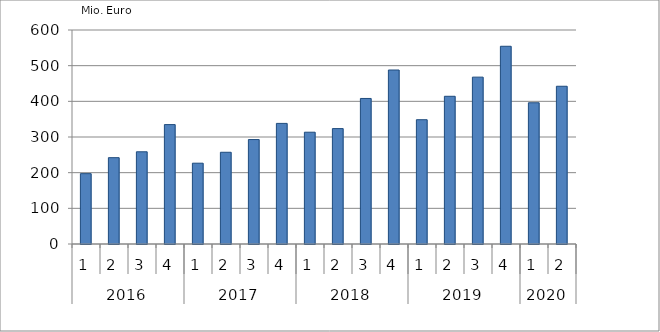
| Category | Ausbaugewerblicher Umsatz3 |
|---|---|
| 0 | 197219.532 |
| 1 | 242069.899 |
| 2 | 258547.84 |
| 3 | 334764.305 |
| 4 | 226552.317 |
| 5 | 257191.13 |
| 6 | 292853.372 |
| 7 | 338154.691 |
| 8 | 313433.569 |
| 9 | 323547.694 |
| 10 | 408057.42 |
| 11 | 487843.765 |
| 12 | 348466.115 |
| 13 | 414145.554 |
| 14 | 467849.207 |
| 15 | 554369.34 |
| 16 | 395996.128 |
| 17 | 442270.528 |